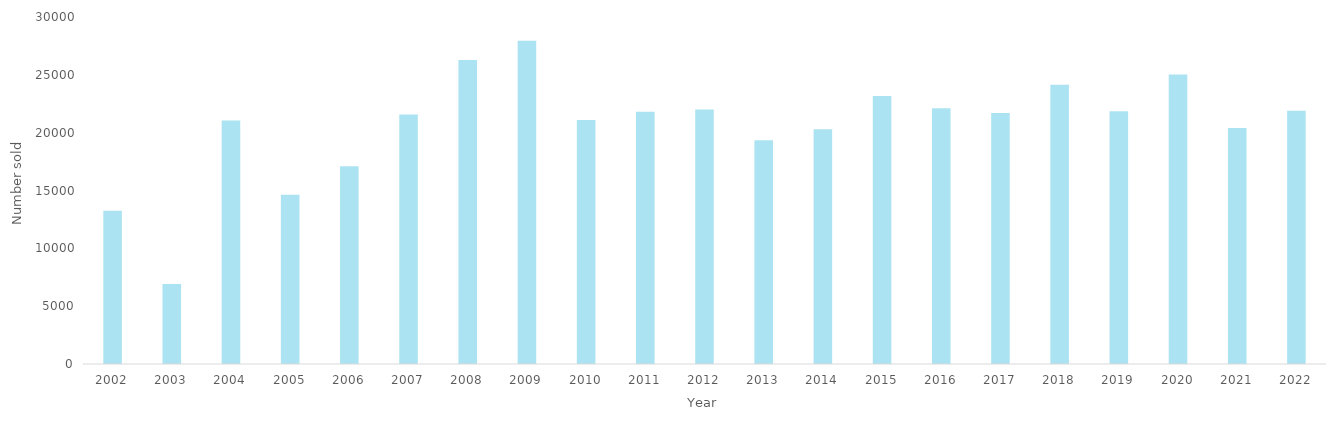
| Category | Series 0 |
|---|---|
| 2002.0 | 13240 |
| 2003.0 | 6909 |
| 2004.0 | 21045 |
| 2005.0 | 14628 |
| 2006.0 | 17096 |
| 2007.0 | 21578 |
| 2008.0 | 26292 |
| 2009.0 | 27948 |
| 2010.0 | 21098 |
| 2011.0 | 21812 |
| 2012.0 | 22002 |
| 2013.0 | 19354 |
| 2014.0 | 20289 |
| 2015.0 | 23169 |
| 2016.0 | 22113 |
| 2017.0 | 21706 |
| 2018.0 | 24152 |
| 2019.0 | 21842 |
| 2020.0 | 25039 |
| 2021.0 | 20396 |
| 2022.0 | 21904 |